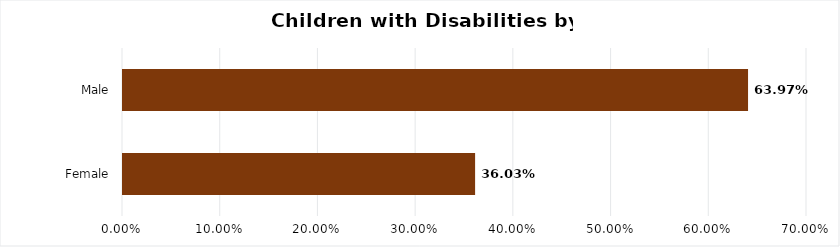
| Category | Series 0 |
|---|---|
| Female | 0.36 |
| Male | 0.64 |